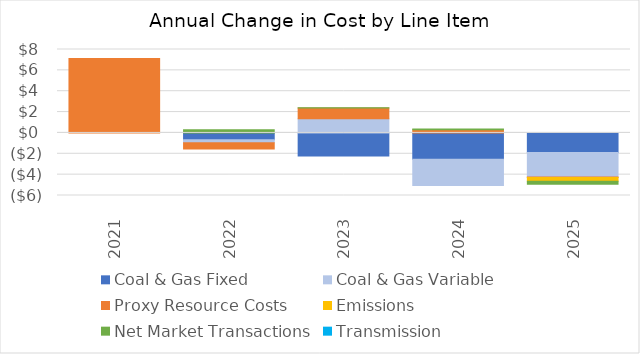
| Category | Coal & Gas Fixed | Coal & Gas Variable | Proxy Resource Costs | Emissions | Net Market Transactions | Transmission |
|---|---|---|---|---|---|---|
| 2021.0 | 0 | 0 | 7.14 | 0 | 0 | 0 |
| 2022.0 | -0.647 | -0.292 | -0.597 | 0 | 0.294 | 0 |
| 2023.0 | -2.213 | 1.361 | 1.028 | 0 | 0.023 | 0 |
| 2024.0 | -2.527 | -2.522 | 0.299 | 0 | 0.089 | 0 |
| 2025.0 | -1.877 | -2.34 | -0.046 | -0.363 | -0.298 | 0 |